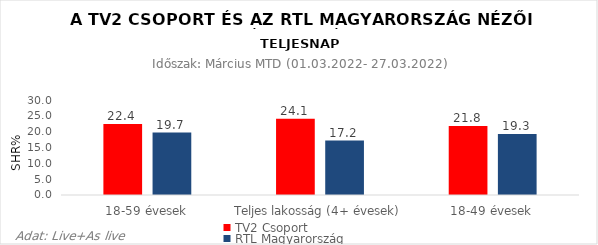
| Category | TV2 Csoport | RTL Magyarország |
|---|---|---|
| 18-59 évesek | 22.4 | 19.7 |
| Teljes lakosság (4+ évesek) | 24.1 | 17.2 |
| 18-49 évesek | 21.8 | 19.3 |